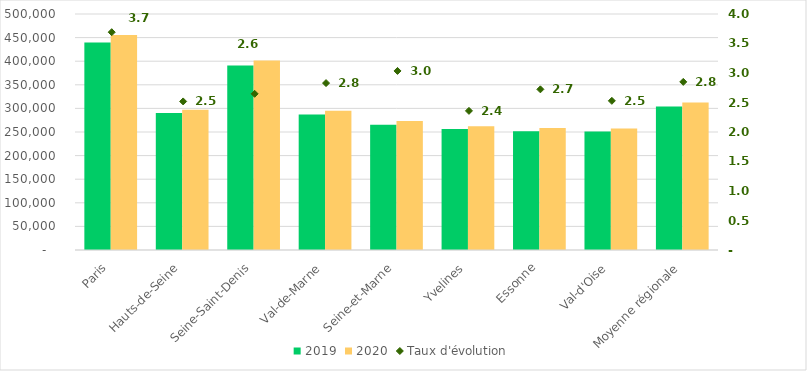
| Category | 2019 | 2020 |
|---|---|---|
| Paris | 439465 | 455688 |
| Hauts-de-Seine | 290070 | 297374 |
| Seine-Saint-Denis | 391075 | 401428 |
| Val-de-Marne | 287055 | 295176 |
| Seine-et-Marne | 265491 | 273548 |
| Yvelines | 256206 | 262248 |
| Essonne | 251682 | 258535 |
| Val-d'Oise | 251243 | 257595 |
| Moyenne régionale | 304035.875 | 312699 |